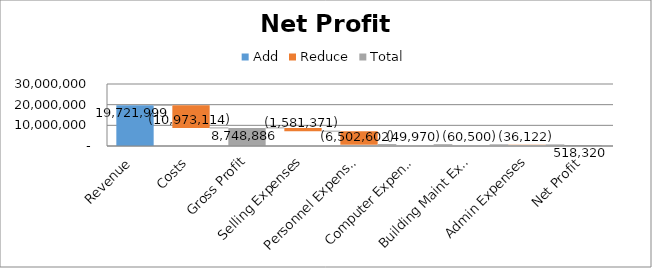
| Category | Series 0 |
|---|---|
| Selling Expenses | 1581371.32 |
| Personnel Expenses | 6502602.44 |
| Computer Expenses | 49969.72 |
| Building Maintenance Expenses | 60500.24 |
| Administrative Expenses | 36122.44 |